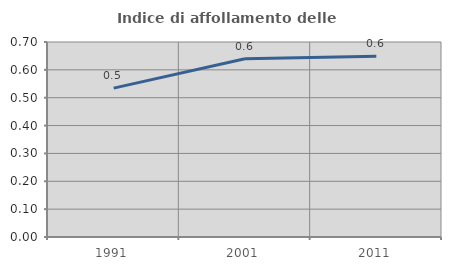
| Category | Indice di affollamento delle abitazioni  |
|---|---|
| 1991.0 | 0.535 |
| 2001.0 | 0.64 |
| 2011.0 | 0.649 |